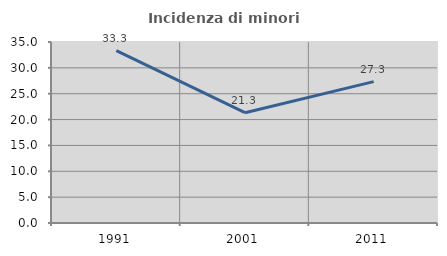
| Category | Incidenza di minori stranieri |
|---|---|
| 1991.0 | 33.333 |
| 2001.0 | 21.333 |
| 2011.0 | 27.336 |